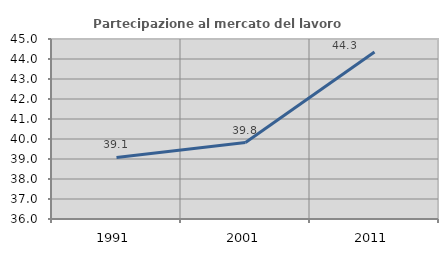
| Category | Partecipazione al mercato del lavoro  femminile |
|---|---|
| 1991.0 | 39.079 |
| 2001.0 | 39.823 |
| 2011.0 | 44.346 |